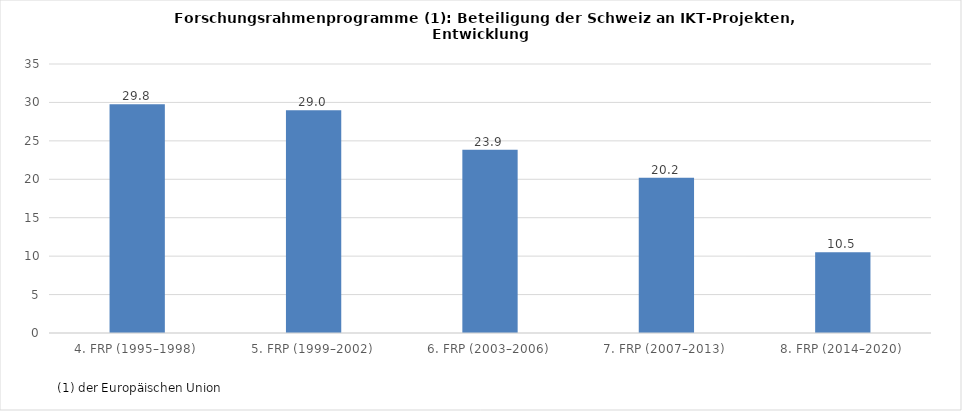
| Category | Series 0 |
|---|---|
| 4. FRP (1995–1998)  | 29.759 |
| 5. FRP (1999–2002)  | 28.988 |
| 6. FRP (2003–2006)  | 23.852 |
| 7. FRP (2007–2013)  | 20.196 |
| 8. FRP (2014–2020)  | 10.497 |